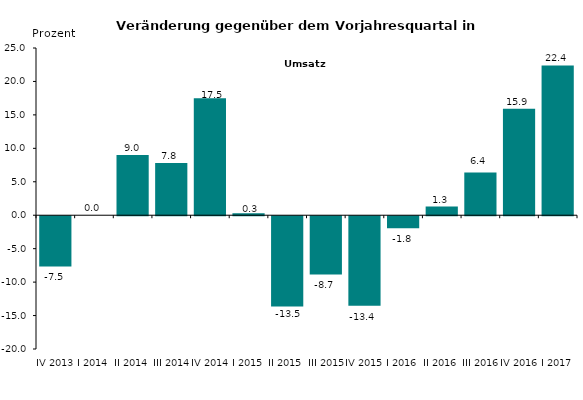
| Category | -7,5 0,0 9,0 7,8 17,5 0,3 -13,5 -8,7 -13,4 -1,8 1,3 6,4 15,9 22,4 |
|---|---|
| IV 2013 | -7.5 |
| I 2014 | 0 |
| II 2014 | 9 |
| III 2014 | 7.8 |
| IV 2014 | 17.5 |
| I 2015 | 0.3 |
| II 2015 | -13.5 |
| III 2015 | -8.7 |
| IV 2015 | -13.4 |
| I 2016 | -1.8 |
| II 2016 | 1.3 |
| III 2016 | 6.4 |
| IV 2016 | 15.9 |
| I 2017 | 22.4 |